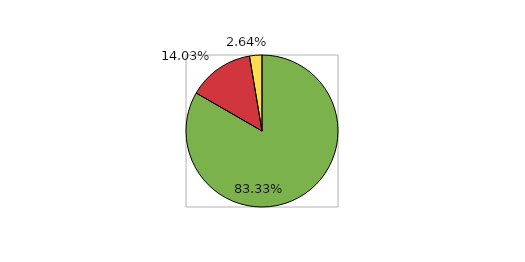
| Category | Series 0 |
|---|---|
| 0 | 0.833 |
| 1 | 0.14 |
| 2 | 0.026 |